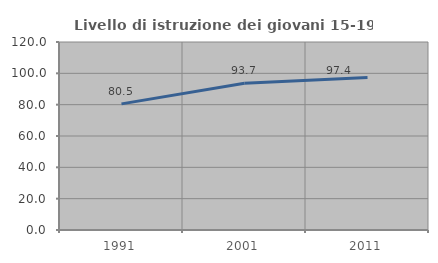
| Category | Livello di istruzione dei giovani 15-19 anni |
|---|---|
| 1991.0 | 80.516 |
| 2001.0 | 93.692 |
| 2011.0 | 97.398 |